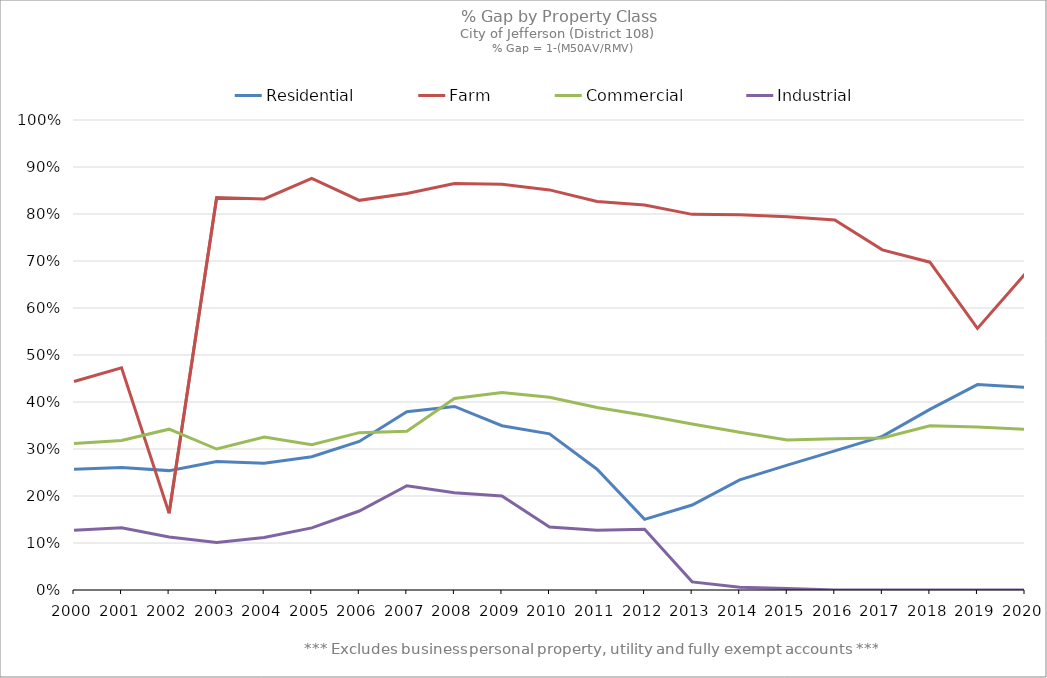
| Category | Residential | Farm | Commercial | Industrial |
|---|---|---|---|---|
| 2000.0 | 0.257 | 0.444 | 0.312 | 0.127 |
| 2001.0 | 0.261 | 0.473 | 0.318 | 0.133 |
| 2002.0 | 0.254 | 0.163 | 0.342 | 0.113 |
| 2003.0 | 0.273 | 0.835 | 0.3 | 0.101 |
| 2004.0 | 0.27 | 0.832 | 0.325 | 0.112 |
| 2005.0 | 0.283 | 0.876 | 0.309 | 0.132 |
| 2006.0 | 0.316 | 0.829 | 0.335 | 0.168 |
| 2007.0 | 0.379 | 0.843 | 0.338 | 0.222 |
| 2008.0 | 0.391 | 0.865 | 0.407 | 0.207 |
| 2009.0 | 0.349 | 0.863 | 0.42 | 0.2 |
| 2010.0 | 0.332 | 0.851 | 0.41 | 0.134 |
| 2011.0 | 0.257 | 0.826 | 0.388 | 0.127 |
| 2012.0 | 0.15 | 0.819 | 0.372 | 0.129 |
| 2013.0 | 0.181 | 0.799 | 0.353 | 0.017 |
| 2014.0 | 0.234 | 0.798 | 0.336 | 0.006 |
| 2015.0 | 0.266 | 0.794 | 0.319 | 0.003 |
| 2016.0 | 0.296 | 0.787 | 0.322 | 0 |
| 2017.0 | 0.327 | 0.724 | 0.323 | 0 |
| 2018.0 | 0.384 | 0.697 | 0.349 | 0 |
| 2019.0 | 0.437 | 0.557 | 0.347 | 0 |
| 2020.0 | 0.431 | 0.672 | 0.342 | 0 |